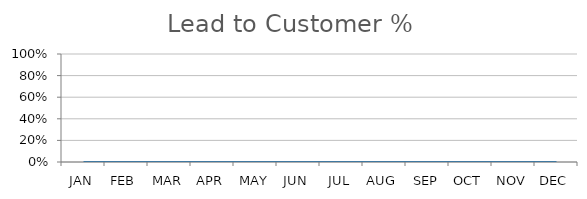
| Category | Lead to Customer % |
|---|---|
| JAN | 0 |
| FEB | 0 |
| MAR | 0 |
| APR | 0 |
| MAY | 0 |
| JUN | 0 |
| JUL | 0 |
| AUG | 0 |
| SEP | 0 |
| OCT | 0 |
| NOV | 0 |
| DEC | 0 |